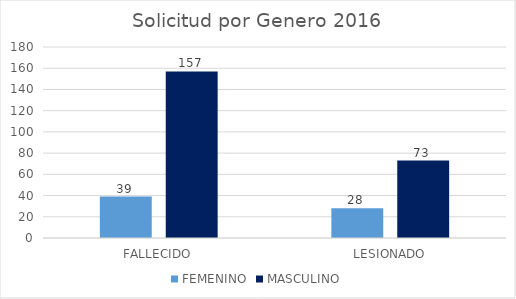
| Category | FEMENINO | MASCULINO |
|---|---|---|
| FALLECIDO | 39 | 157 |
| LESIONADO | 28 | 73 |